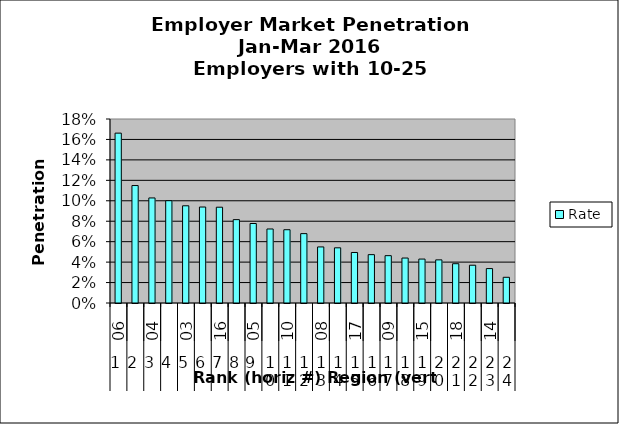
| Category | Rate |
|---|---|
| 0 | 0.166 |
| 1 | 0.115 |
| 2 | 0.103 |
| 3 | 0.1 |
| 4 | 0.095 |
| 5 | 0.094 |
| 6 | 0.094 |
| 7 | 0.082 |
| 8 | 0.078 |
| 9 | 0.072 |
| 10 | 0.072 |
| 11 | 0.068 |
| 12 | 0.055 |
| 13 | 0.054 |
| 14 | 0.049 |
| 15 | 0.047 |
| 16 | 0.046 |
| 17 | 0.044 |
| 18 | 0.043 |
| 19 | 0.042 |
| 20 | 0.038 |
| 21 | 0.037 |
| 22 | 0.034 |
| 23 | 0.025 |